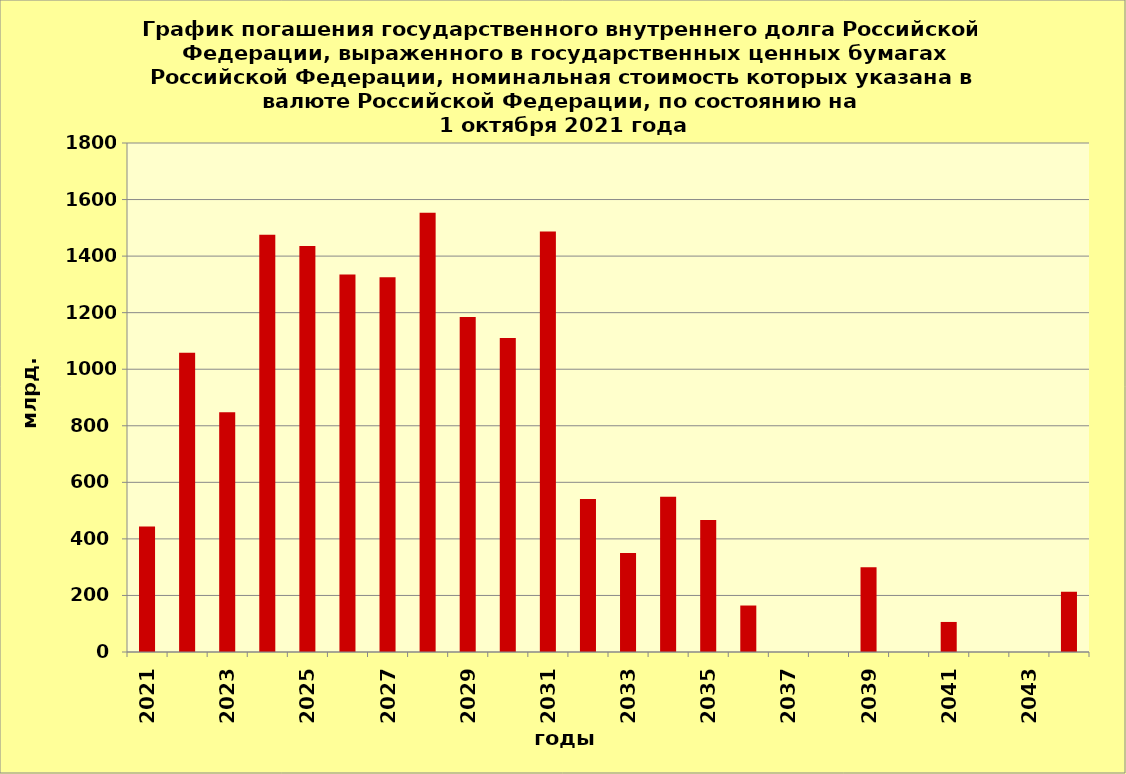
| Category | ряд 1 |
|---|---|
| 2021.0 | 444.121 |
| 2022.0 | 1058.145 |
| 2023.0 | 848.065 |
| 2024.0 | 1475.566 |
| 2025.0 | 1435.907 |
| 2026.0 | 1334.561 |
| 2027.0 | 1324.833 |
| 2028.0 | 1553.746 |
| 2029.0 | 1184.638 |
| 2030.0 | 1110.711 |
| 2031.0 | 1486.904 |
| 2032.0 | 540.894 |
| 2033.0 | 350 |
| 2034.0 | 548.84 |
| 2035.0 | 467.105 |
| 2036.0 | 164.372 |
| 2037.0 | 0 |
| 2038.0 | 0 |
| 2039.0 | 300 |
| 2040.0 | 0 |
| 2041.0 | 106.269 |
| 2042.0 | 0 |
| 2043.0 | 0 |
| 2044.0 | 212.636 |